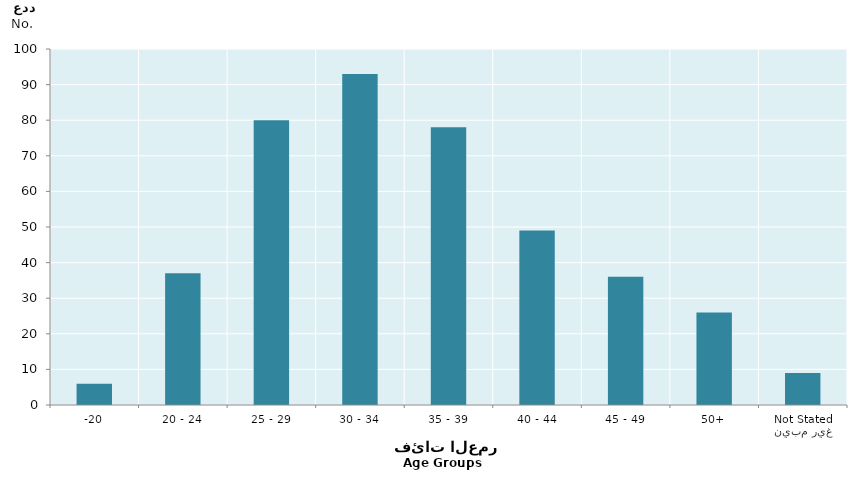
| Category | Series 0 |
|---|---|
| -20 | 6 |
| 20 - 24 | 37 |
| 25 - 29 | 80 |
| 30 - 34 | 93 |
| 35 - 39 | 78 |
| 40 - 44 | 49 |
| 45 - 49 | 36 |
| 50+ | 26 |
| غير مبين
Not Stated | 9 |